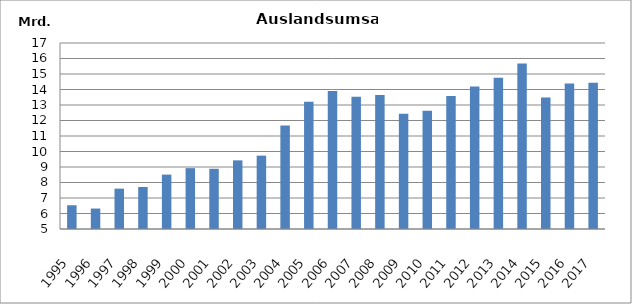
| Category | 1995 1996 1997 1998 1999 2000 2001 2002 2003 2004 2005 2006 2007 2008 2009 2010 2011 2012 2013 2014 2015 2016 2017 |
|---|---|
| 1995 | 6532952 |
| 1996 | 6319142 |
| 1997 | 7603819 |
| 1998 | 7711587 |
| 1999 | 8508603 |
| 2000 | 8925754 |
| 2001 | 8885463 |
| 2002 | 9428713 |
| 2003 | 9733339 |
| 2004 | 11680546 |
| 2005 | 13208153 |
| 2006 | 13901521 |
| 2007 | 13537187 |
| 2008 | 13649884 |
| 2009 | 12432618 |
| 2010 | 12628416.402 |
| 2011 | 13577795 |
| 2012 | 14199097 |
| 2013 | 14765099 |
| 2014 | 15677925 |
| 2015 | 13486756 |
| 2016 | 14385658 |
| 2017 | 14436506 |